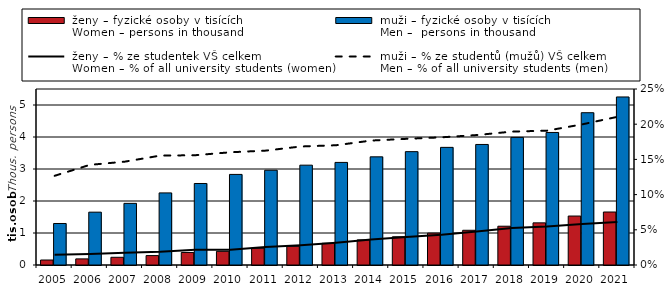
| Category |  ženy – fyzické osoby v tisících
 Women – persons in thousand |  muži – fyzické osoby v tisících
 Men –  persons in thousand |
|---|---|---|
| 2005.0 | 0.156 | 1.297 |
| 2006.0 | 0.191 | 1.651 |
| 2007.0 | 0.241 | 1.926 |
| 2008.0 | 0.294 | 2.253 |
| 2009.0 | 0.392 | 2.547 |
| 2010.0 | 0.427 | 2.831 |
| 2011.0 | 0.523 | 2.961 |
| 2012.0 | 0.585 | 3.12 |
| 2013.0 | 0.678 | 3.206 |
| 2014.0 | 0.785 | 3.38 |
| 2015.0 | 0.882 | 3.542 |
| 2016.0 | 0.996 | 3.676 |
| 2017.0 | 1.085 | 3.767 |
| 2018.0 | 1.212 | 3.988 |
| 2019.0 | 1.317 | 4.142 |
| 2020.0 | 1.53 | 4.759 |
| 2021.0 | 1.656 | 5.251 |